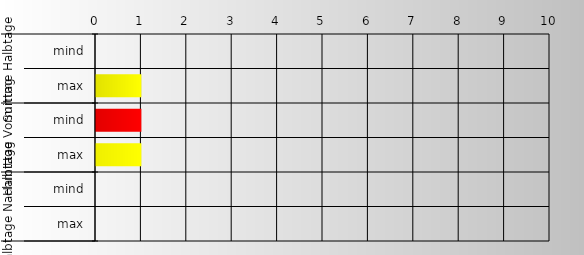
| Category | Series 0 |
|---|---|
| 0 | 0 |
| 1 | 1 |
| 2 | 1 |
| 3 | 1 |
| 4 | 0 |
| 5 | 0 |